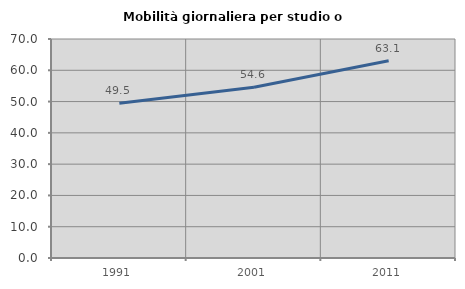
| Category | Mobilità giornaliera per studio o lavoro |
|---|---|
| 1991.0 | 49.499 |
| 2001.0 | 54.565 |
| 2011.0 | 63.066 |